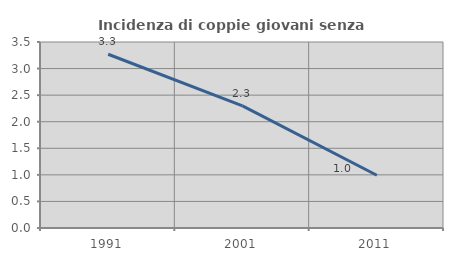
| Category | Incidenza di coppie giovani senza figli |
|---|---|
| 1991.0 | 3.27 |
| 2001.0 | 2.299 |
| 2011.0 | 0.993 |